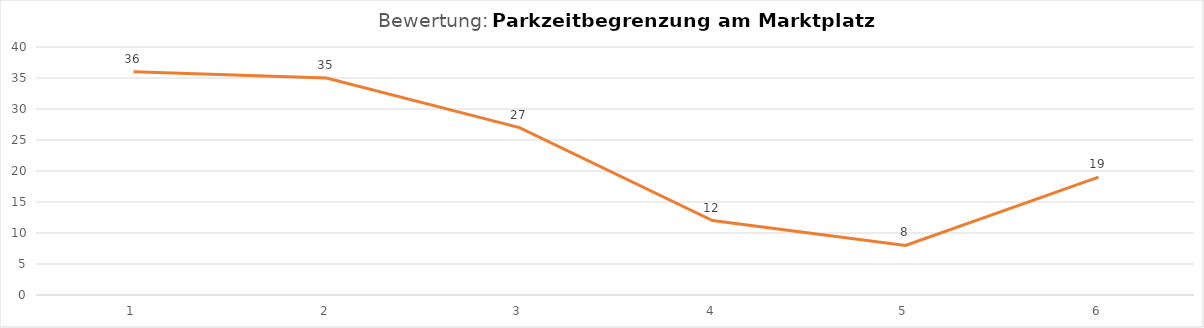
| Category | Series 0 |
|---|---|
| 1.0 | 36 |
| 2.0 | 35 |
| 3.0 | 27 |
| 4.0 | 12 |
| 5.0 | 8 |
| 6.0 | 19 |